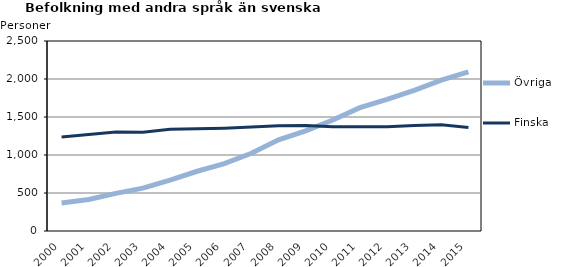
| Category | Övriga | Finska |
|---|---|---|
| 2000.0 | 369 | 1238 |
| 2001.0 | 414 | 1271 |
| 2002.0 | 495 | 1301 |
| 2003.0 | 564 | 1298 |
| 2004.0 | 669 | 1339 |
| 2005.0 | 786 | 1344 |
| 2006.0 | 887 | 1352 |
| 2007.0 | 1022 | 1367 |
| 2008.0 | 1200 | 1385 |
| 2009.0 | 1318 | 1388 |
| 2010.0 | 1461 | 1373 |
| 2011.0 | 1623 | 1371 |
| 2012.0 | 1732 | 1371 |
| 2013.0 | 1850 | 1387 |
| 2014.0 | 1986 | 1398 |
| 2015.0 | 2093 | 1363 |